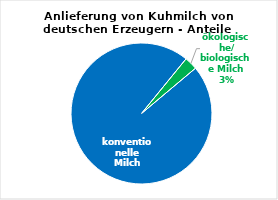
| Category | Series 0 |
|---|---|
| 0 | 30316045.055 |
| 1 | 939080.644 |